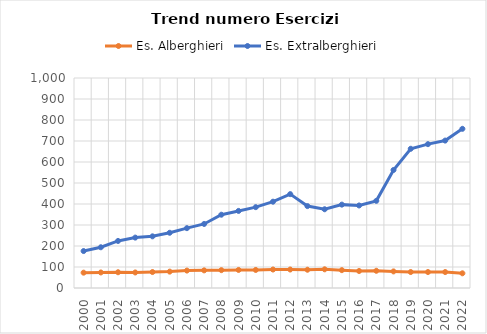
| Category | Es. Alberghieri | Es. Extralberghieri |
|---|---|---|
| 2000.0 | 73 | 176 |
| 2001.0 | 74 | 194 |
| 2002.0 | 75 | 224 |
| 2003.0 | 74 | 240 |
| 2004.0 | 76 | 246 |
| 2005.0 | 78 | 263 |
| 2006.0 | 83 | 285 |
| 2007.0 | 84 | 305 |
| 2008.0 | 85 | 349 |
| 2009.0 | 86 | 367 |
| 2010.0 | 86 | 385 |
| 2011.0 | 88 | 411 |
| 2012.0 | 88 | 447 |
| 2013.0 | 87 | 390 |
| 2014.0 | 89 | 375 |
| 2015.0 | 85 | 397 |
| 2016.0 | 81 | 393 |
| 2017.0 | 82 | 415 |
| 2018.0 | 79 | 562 |
| 2019.0 | 76 | 663 |
| 2020.0 | 76 | 685 |
| 2021.0 | 76 | 702 |
| 2022.0 | 70 | 758 |